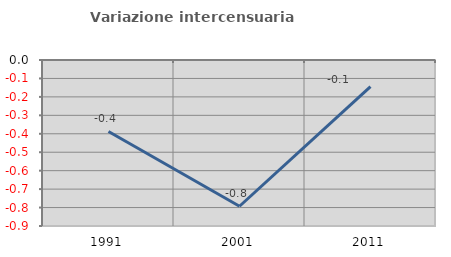
| Category | Variazione intercensuaria annua |
|---|---|
| 1991.0 | -0.387 |
| 2001.0 | -0.793 |
| 2011.0 | -0.144 |